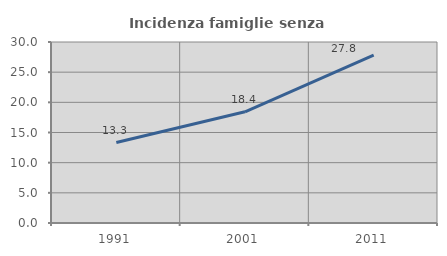
| Category | Incidenza famiglie senza nuclei |
|---|---|
| 1991.0 | 13.334 |
| 2001.0 | 18.433 |
| 2011.0 | 27.813 |